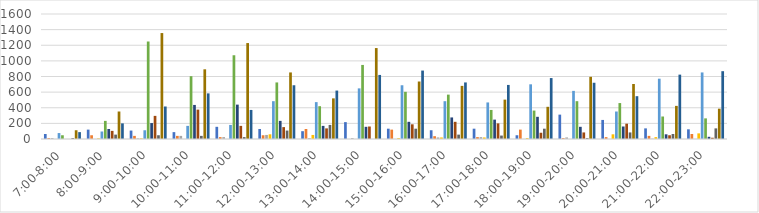
| Category | Series 0 | Series 1 | Series 2 | Series 3 | Series 4 | Series 5 | Series 6 | Series 7 | Series 8 | Series 9 | Series 10 |
|---|---|---|---|---|---|---|---|---|---|---|---|
| 7:00-8:00 | 64 | 12 | 12 | 0 | 76 | 48 | 0 | 0 | 12 | 112 | 88 |
| 8:00-9:00 | 120 | 48 | 0 | 8 | 96 | 232 | 128 | 104 | 56 | 352 | 200 |
| 9:00-10:00 | 108 | 40 | 8 | 8 | 112 | 1248 | 204 | 296 | 48 | 1356 | 416 |
| 10:00-11:00 | 88 | 40 | 40 | 0 | 168 | 804 | 436 | 376 | 40 | 892 | 584 |
| 11:00-12:00 | 156 | 24 | 24 | 0 | 180 | 1072 | 440 | 168 | 24 | 1228 | 372 |
| 12:00-13:00 | 128 | 48 | 52 | 60 | 484 | 724 | 232 | 152 | 108 | 852 | 688 |
| 13:00-14:00 | 100 | 128 | 12 | 52 | 472 | 420 | 168 | 136 | 180 | 520 | 620 |
| 14:00-15:00 | 216 | 0 | 12 | 0 | 648 | 948 | 156 | 160 | 0 | 1164 | 820 |
| 15:00-16:00 | 132 | 120 | 0 | 12 | 688 | 604 | 220 | 188 | 132 | 736 | 876 |
| 16:00-17:00 | 112 | 36 | 20 | 20 | 484 | 568 | 276 | 220 | 56 | 680 | 724 |
| 17:00-18:00 | 132 | 24 | 24 | 20 | 468 | 372 | 248 | 200 | 44 | 504 | 692 |
| 18:00-19:00 | 48 | 120 | 0 | 12 | 700 | 364 | 284 | 80 | 132 | 412 | 780 |
| 19:00-20:00 | 312 | 12 | 20 | 0 | 616 | 484 | 156 | 84 | 12 | 796 | 720 |
| 20:00-21:00 | 244 | 24 | 0 | 60 | 352 | 460 | 160 | 196 | 84 | 704 | 548 |
| 21:00-22:00 | 136 | 40 | 4 | 24 | 772 | 288 | 60 | 48 | 64 | 424 | 824 |
| 22:00-23:00 | 124 | 64 | 0 | 72 | 852 | 264 | 28 | 16 | 136 | 388 | 868 |